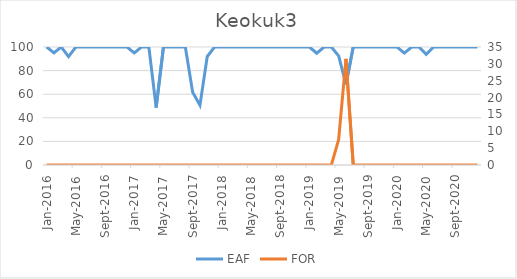
| Category | EAF |
|---|---|
| 2016-01-01 | 100 |
| 2016-02-01 | 95.07 |
| 2016-03-01 | 100 |
| 2016-04-01 | 91.86 |
| 2016-05-01 | 100 |
| 2016-06-01 | 100 |
| 2016-07-01 | 100 |
| 2016-08-01 | 100 |
| 2016-09-01 | 100 |
| 2016-10-01 | 100 |
| 2016-11-01 | 100 |
| 2016-12-01 | 100 |
| 2017-01-01 | 94.96 |
| 2017-02-01 | 100 |
| 2017-03-01 | 100 |
| 2017-04-01 | 48.68 |
| 2017-05-01 | 100 |
| 2017-06-01 | 100 |
| 2017-07-01 | 100 |
| 2017-08-01 | 100 |
| 2017-09-01 | 61.73 |
| 2017-10-01 | 50.69 |
| 2017-11-01 | 91.98 |
| 2017-12-01 | 100 |
| 2018-01-01 | 100 |
| 2018-02-01 | 100 |
| 2018-03-01 | 100 |
| 2018-04-01 | 100 |
| 2018-05-01 | 100 |
| 2018-06-01 | 99.98 |
| 2018-07-01 | 100 |
| 2018-08-01 | 100 |
| 2018-09-01 | 100 |
| 2018-10-01 | 100 |
| 2018-11-01 | 100 |
| 2018-12-01 | 100 |
| 2019-01-01 | 100 |
| 2019-02-01 | 94.72 |
| 2019-03-01 | 100 |
| 2019-04-01 | 100 |
| 2019-05-01 | 92.46 |
| 2019-06-01 | 68.29 |
| 2019-07-01 | 100 |
| 2019-08-01 | 100 |
| 2019-09-01 | 100 |
| 2019-10-01 | 100 |
| 2019-11-01 | 100 |
| 2019-12-01 | 100 |
| 2020-01-01 | 100 |
| 2020-02-01 | 94.85 |
| 2020-03-01 | 100 |
| 2020-04-01 | 100 |
| 2020-05-01 | 93.82 |
| 2020-06-01 | 100 |
| 2020-07-01 | 100 |
| 2020-08-01 | 100 |
| 2020-09-01 | 100 |
| 2020-10-01 | 100 |
| 2020-11-01 | 100 |
| 2020-12-01 | 100 |